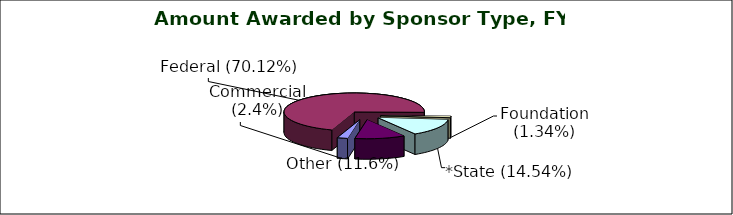
| Category | Series 0 |
|---|---|
| Commercial (2.4%) | 0.024 |
| Federal (70.12%) | 0.701 |
| Foundation (1.34%) | 0.013 |
| *State (14.54%) | 0.145 |
| Other (11.6%) | 0.116 |